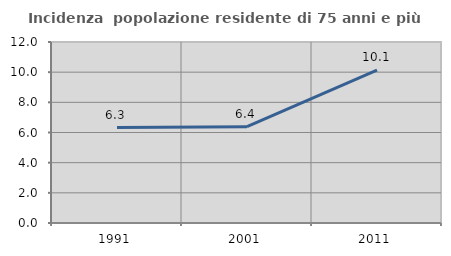
| Category | Incidenza  popolazione residente di 75 anni e più |
|---|---|
| 1991.0 | 6.33 |
| 2001.0 | 6.382 |
| 2011.0 | 10.129 |